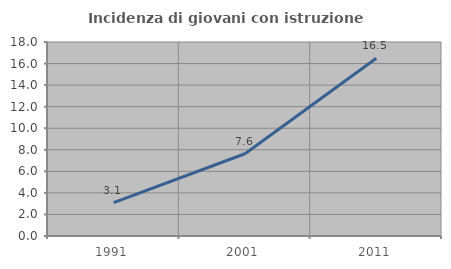
| Category | Incidenza di giovani con istruzione universitaria |
|---|---|
| 1991.0 | 3.097 |
| 2001.0 | 7.631 |
| 2011.0 | 16.495 |